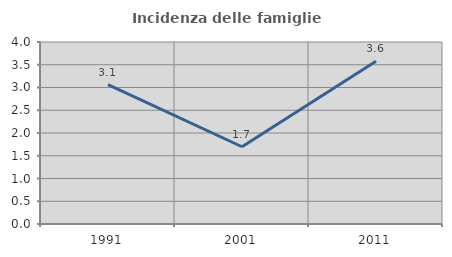
| Category | Incidenza delle famiglie numerose |
|---|---|
| 1991.0 | 3.065 |
| 2001.0 | 1.698 |
| 2011.0 | 3.577 |